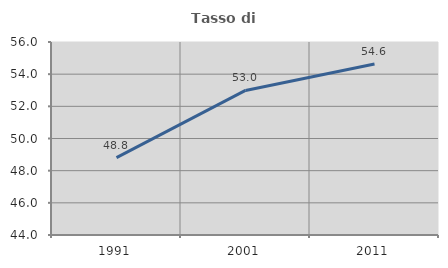
| Category | Tasso di occupazione   |
|---|---|
| 1991.0 | 48.808 |
| 2001.0 | 52.989 |
| 2011.0 | 54.626 |